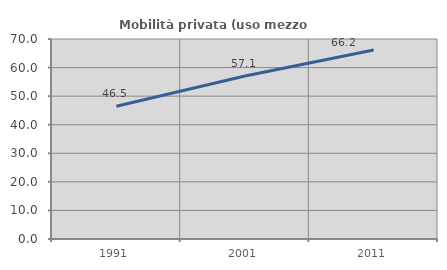
| Category | Mobilità privata (uso mezzo privato) |
|---|---|
| 1991.0 | 46.465 |
| 2001.0 | 57.052 |
| 2011.0 | 66.164 |